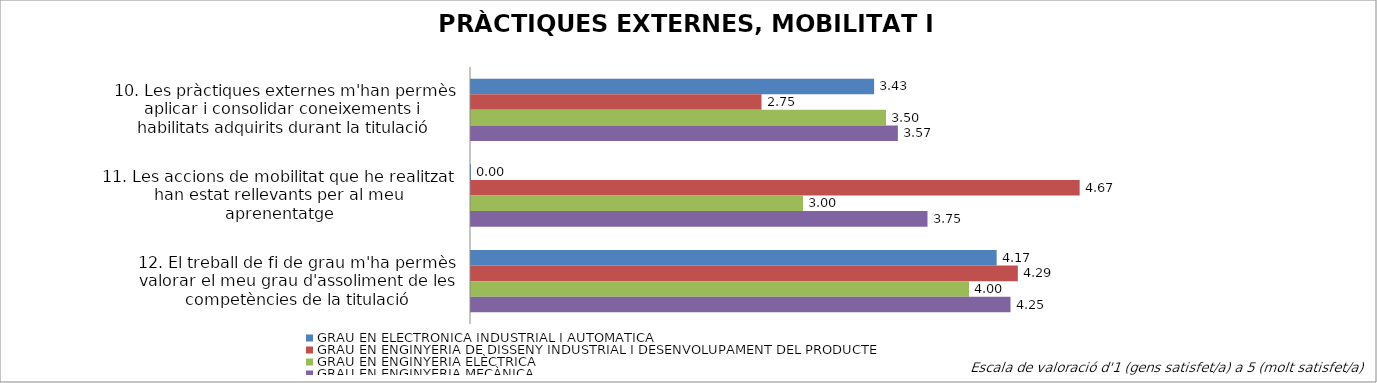
| Category | GRAU EN ELECTRÒNICA INDUSTRIAL I AUTOMÀTICA | GRAU EN ENGINYERIA DE DISSENY INDUSTRIAL I DESENVOLUPAMENT DEL PRODUCTE | GRAU EN ENGINYERIA ELÈCTRICA | GRAU EN ENGINYERIA MECÀNICA |
|---|---|---|---|---|
| 10. Les pràctiques externes m'han permès aplicar i consolidar coneixements i  habilitats adquirits durant la titulació | 3.429 | 2.75 | 3.5 | 3.571 |
| 11. Les accions de mobilitat que he realitzat han estat rellevants per al meu aprenentatge | 0 | 4.667 | 3 | 3.75 |
| 12. El treball de fi de grau m'ha permès valorar el meu grau d'assoliment de les competències de la titulació | 4.167 | 4.294 | 4 | 4.25 |